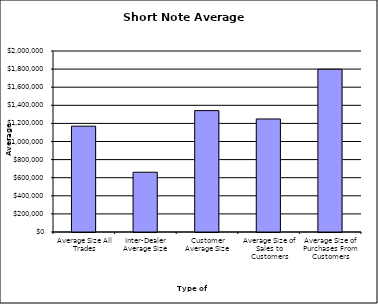
| Category | Security Type |
|---|---|
| Average Size All Trades | 1169466.691 |
| Inter-Dealer Average Size | 660275.081 |
| Customer Average Size | 1341235.477 |
| Average Size of Sales to Customers | 1248912.988 |
| Average Size of Purchases From Customers | 1798051.948 |